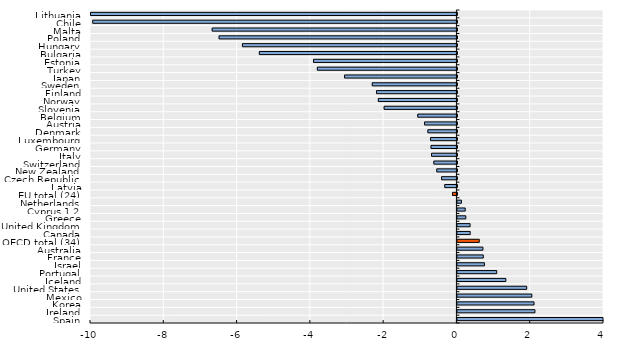
| Category | Foreign-born women |
|---|---|
| Spain | 4.125 |
| Ireland | 2.115 |
| Korea | 2.091 |
| Mexico | 2.031 |
| United States | 1.89 |
| Iceland | 1.321 |
| Portugal | 1.073 |
| Israel | 0.737 |
| France | 0.706 |
| Australia | 0.696 |
| OECD total (34) | 0.596 |
| Canada | 0.349 |
| United Kingdom | 0.346 |
| Greece | 0.229 |
| Cyprus 1,2 | 0.213 |
| Netherlands | 0.108 |
| EU total (24) | -0.121 |
| Latvia | -0.332 |
| Czech Republic | -0.419 |
| New Zealand | -0.551 |
| Switzerland | -0.63 |
| Italy | -0.693 |
| Germany | -0.707 |
| Luxembourg | -0.72 |
| Denmark | -0.793 |
| Austria | -0.883 |
| Belgium | -1.069 |
| Slovenia | -1.987 |
| Norway | -2.145 |
| Finland | -2.194 |
| Sweden | -2.311 |
| Japan | -3.066 |
| Turkey | -3.809 |
| Estonia | -3.914 |
| Bulgaria | -5.392 |
| Hungary | -5.853 |
| Poland | -6.491 |
| Malta | -6.679 |
| Chile | -9.939 |
| Lithuania | -11.094 |